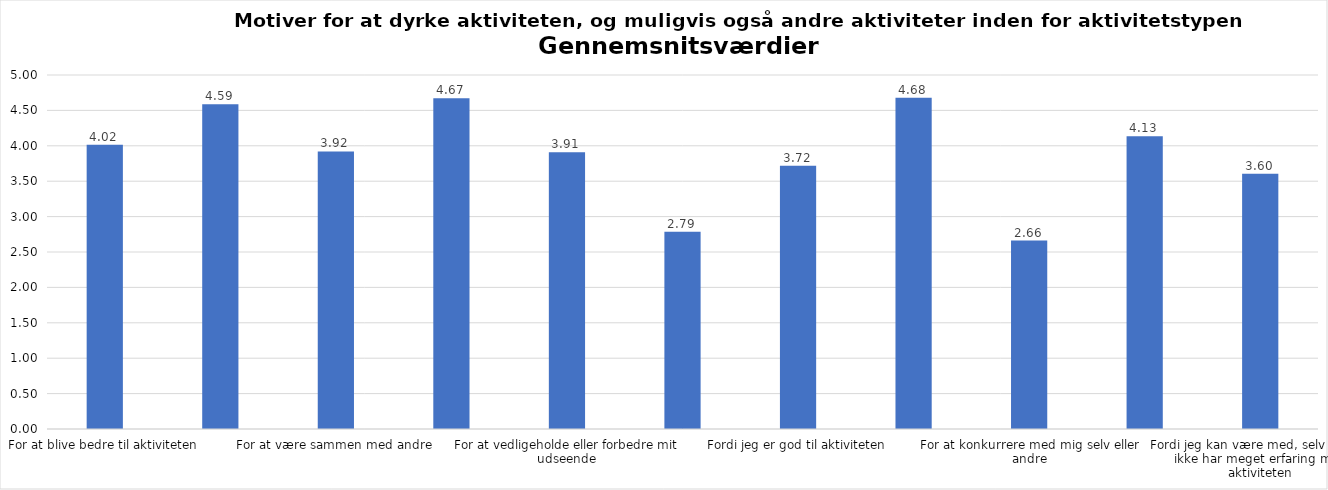
| Category | Gennemsnit |
|---|---|
| For at blive bedre til aktiviteten | 4.015 |
| For at vedligeholde eller forbedre min sundhed (fx helbred, fysisk form) | 4.587 |
| For at være sammen med andre | 3.921 |
| For at gøre noget godt for mig selv | 4.673 |
| For at vedligeholde eller forbedre mit udseende | 3.91 |
| Fordi andre i min omgangskreds opmuntrer mig til det | 2.788 |
| Fordi jeg er god til aktiviteten | 3.718 |
| Fordi jeg godt kan lide aktiviteten | 4.678 |
| For at konkurrere med mig selv eller andre | 2.662 |
| Fordi aktiviteten passer godt ind i min hverdag | 4.134 |
| Fordi jeg kan være med, selv om jeg ikke har meget erfaring med aktiviteten | 3.604 |